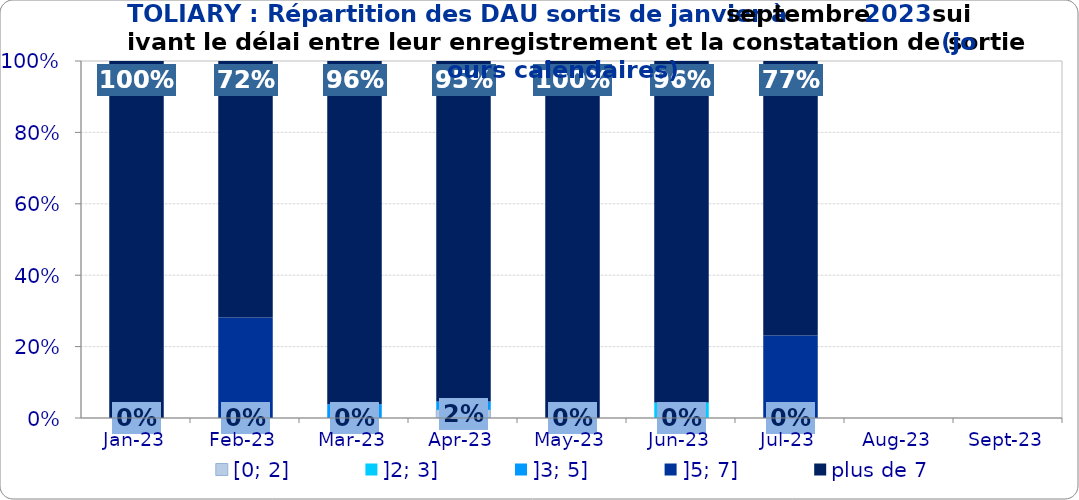
| Category | [0; 2] | ]2; 3] | ]3; 5] | ]5; 7] | plus de 7 |
|---|---|---|---|---|---|
| 2023-01-01 | 0 | 0 | 0 | 0 | 1 |
| 2023-02-01 | 0 | 0 | 0 | 0.281 | 0.719 |
| 2023-03-01 | 0 | 0 | 0.038 | 0 | 0.962 |
| 2023-04-01 | 0.023 | 0 | 0.023 | 0 | 0.953 |
| 2023-05-01 | 0 | 0 | 0 | 0 | 1 |
| 2023-06-01 | 0 | 0.043 | 0 | 0 | 0.957 |
| 2023-07-01 | 0 | 0 | 0 | 0.231 | 0.769 |
| 2023-08-01 | 0 | 0 | 0 | 0 | 0 |
| 2023-09-01 | 0 | 0 | 0 | 0 | 0 |